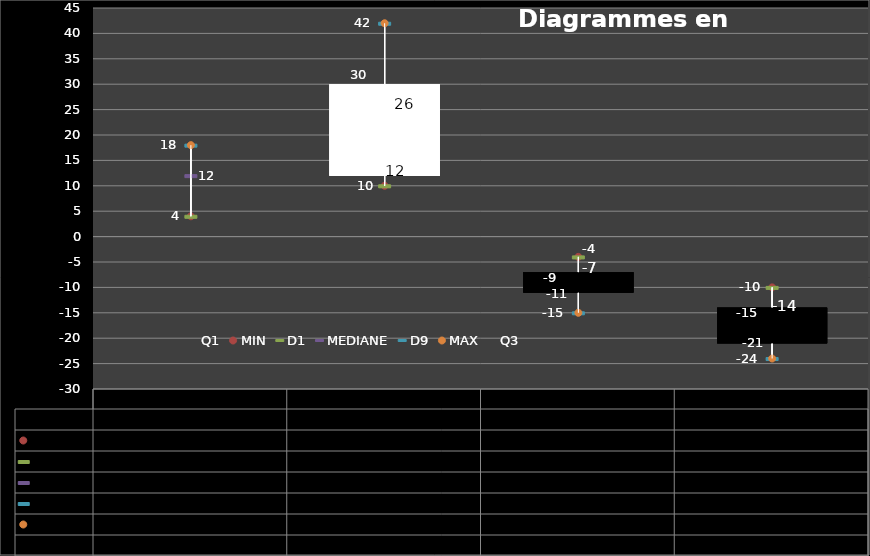
| Category | Q1 | MIN | D1 | MEDIANE | D9 | MAX | Q3 |
|---|---|---|---|---|---|---|---|
| 0 | 12 | 4 | 4 | 12 | 18 | 18 | 12 |
| 1 | 12 | 10 | 10 | 26 | 42 | 42 | 30 |
| 2 | -7 | -4 | -4 | -9 | -15 | -15 | -11 |
| 3 | -14 | -10 | -10 | -15 | -24 | -24 | -21 |